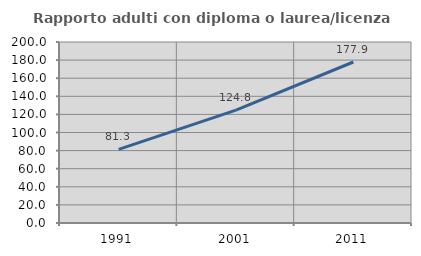
| Category | Rapporto adulti con diploma o laurea/licenza media  |
|---|---|
| 1991.0 | 81.307 |
| 2001.0 | 124.779 |
| 2011.0 | 177.901 |